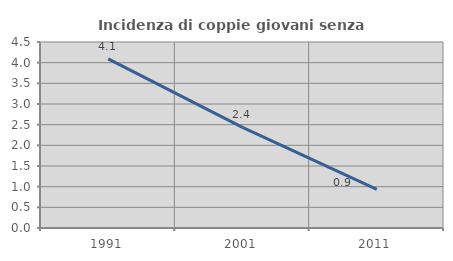
| Category | Incidenza di coppie giovani senza figli |
|---|---|
| 1991.0 | 4.092 |
| 2001.0 | 2.434 |
| 2011.0 | 0.933 |